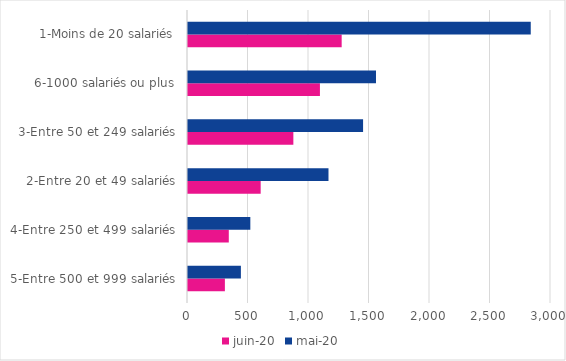
| Category | juin-20 | mai-20 |
|---|---|---|
| 5-Entre 500 et 999 salariés | 304.862 | 437.115 |
| 4-Entre 250 et 499 salariés | 337.137 | 515.113 |
| 2-Entre 20 et 49 salariés | 600.644 | 1161.084 |
| 3-Entre 50 et 249 salariés | 870.73 | 1446.929 |
| 6-1000 salariés ou plus | 1090.355 | 1553.685 |
| 1-Moins de 20 salariés | 1270.024 | 2832.682 |